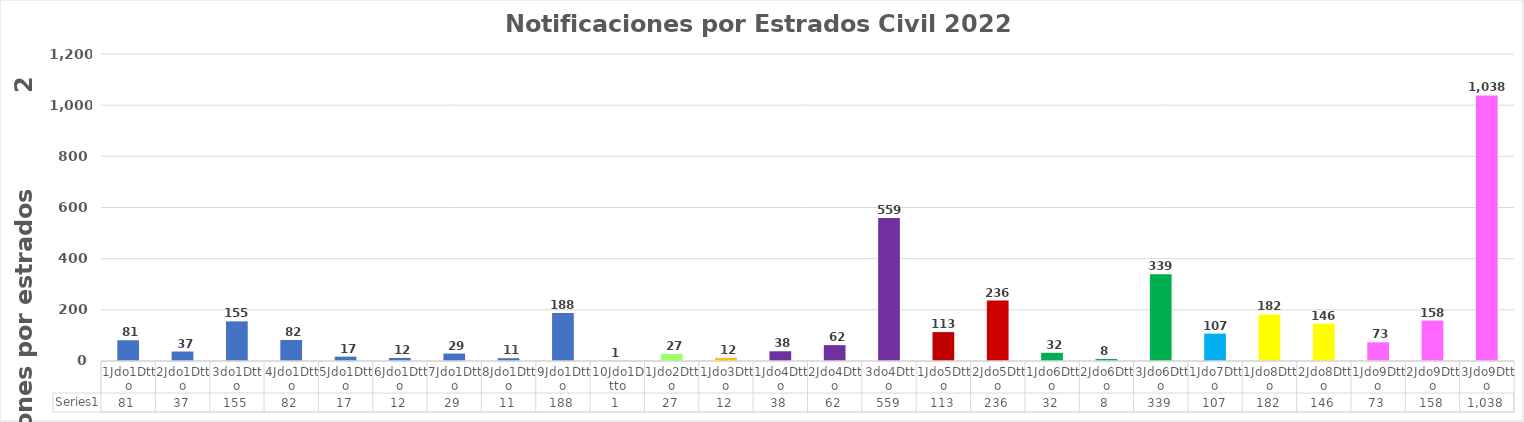
| Category | Series 0 |
|---|---|
| 1Jdo1Dtto | 81 |
| 2Jdo1Dtto | 37 |
| 3do1Dtto | 155 |
| 4Jdo1Dtto | 82 |
| 5Jdo1Dtto | 17 |
| 6Jdo1Dtto | 12 |
| 7Jdo1Dtto | 29 |
| 8Jdo1Dtto | 11 |
| 9Jdo1Dtto | 188 |
| 10Jdo1Dtto | 1 |
| 1Jdo2Dtto | 27 |
| 1Jdo3Dtto | 12 |
| 1Jdo4Dtto | 38 |
| 2Jdo4Dtto | 62 |
| 3do4Dtto | 559 |
| 1Jdo5Dtto | 113 |
| 2Jdo5Dtto | 236 |
| 1Jdo6Dtto | 32 |
| 2Jdo6Dtto | 8 |
| 3Jdo6Dtto | 339 |
| 1Jdo7Dtto | 107 |
| 1Jdo8Dtto | 182 |
| 2Jdo8Dtto | 146 |
| 1Jdo9Dtto | 73 |
| 2Jdo9Dtto | 158 |
| 3Jdo9Dtto | 1038 |